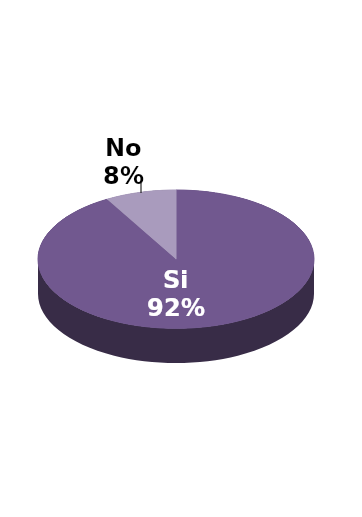
| Category | Series 1 |
|---|---|
| Si | 22 |
| No | 2 |